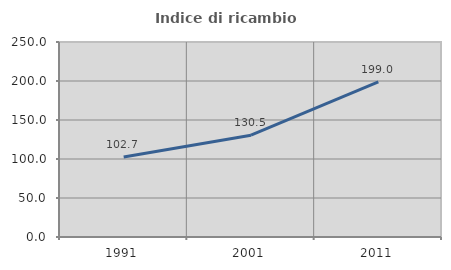
| Category | Indice di ricambio occupazionale  |
|---|---|
| 1991.0 | 102.659 |
| 2001.0 | 130.505 |
| 2011.0 | 199.012 |